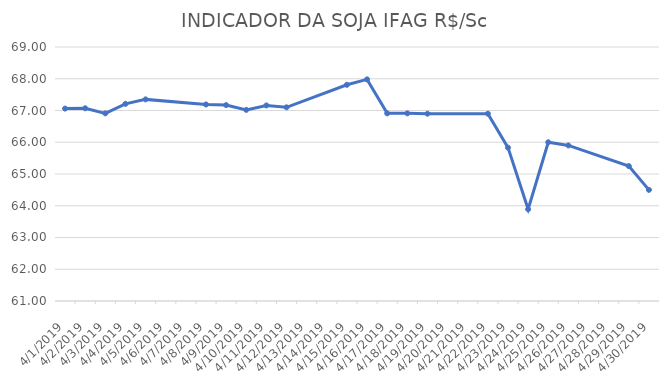
| Category | INDICADOR DA SOJA IFAG |
|---|---|
| 4/1/19 | 67.06 |
| 4/2/19 | 67.07 |
| 4/3/19 | 66.91 |
| 4/4/19 | 67.21 |
| 4/5/19 | 67.35 |
| 4/8/19 | 67.19 |
| 4/9/19 | 67.17 |
| 4/10/19 | 67.02 |
| 4/11/19 | 67.16 |
| 4/12/19 | 67.1 |
| 4/15/19 | 67.81 |
| 4/16/19 | 67.98 |
| 4/17/19 | 66.91 |
| 4/18/19 | 66.91 |
| 4/19/19 | 66.9 |
| 4/22/19 | 66.9 |
| 4/23/19 | 65.83 |
| 4/24/19 | 63.89 |
| 4/25/19 | 66 |
| 4/26/19 | 65.9 |
| 4/29/19 | 65.25 |
| 4/30/19 | 64.5 |